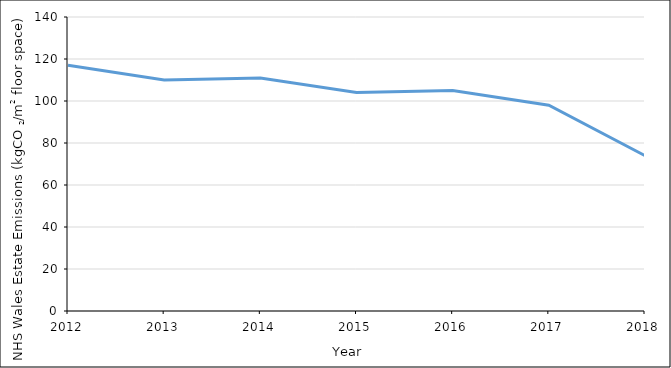
| Category | NHS Wales Estate Emissions (kgCO2/m2 floor space) |
|---|---|
| 2012.0 | 117 |
| 2013.0 | 110 |
| 2014.0 | 111 |
| 2015.0 | 104 |
| 2016.0 | 105 |
| 2017.0 | 98 |
| 2018.0 | 74 |